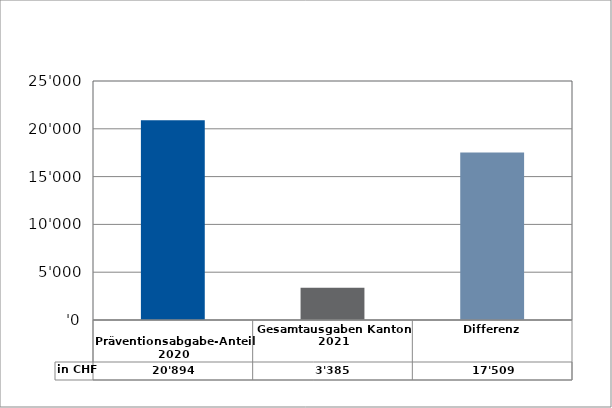
| Category | in CHF |
|---|---|
| 
Präventionsabgabe-Anteil 2020

 | 20894 |
| Gesamtausgaben Kanton 2021
 | 3385 |
| Differenz | 17509 |